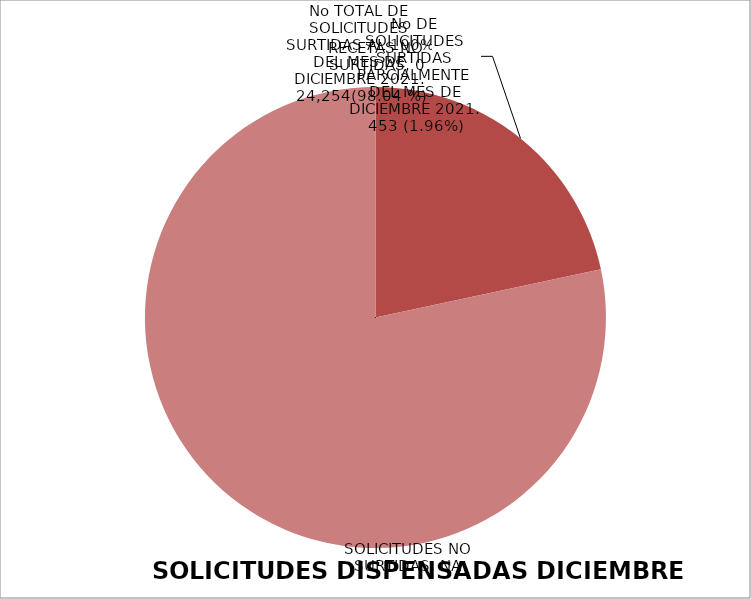
| Category | Series 0 |
|---|---|
| No TOTAL DE RECETAS DEL MES DE ENERO 2024 | 0 |
| No TOTAL DE RECETAS SURTIDAS AL 100% DEL MES DE ENERO 2024 | 580 |
| No DE RECETAS SURTIDAS PARCIALMENTE DEL MES DE  ENERO 2024 | 2099 |
| RECETAS NO SURTIDAS | 0 |